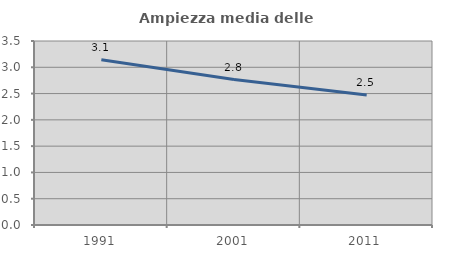
| Category | Ampiezza media delle famiglie |
|---|---|
| 1991.0 | 3.145 |
| 2001.0 | 2.767 |
| 2011.0 | 2.473 |